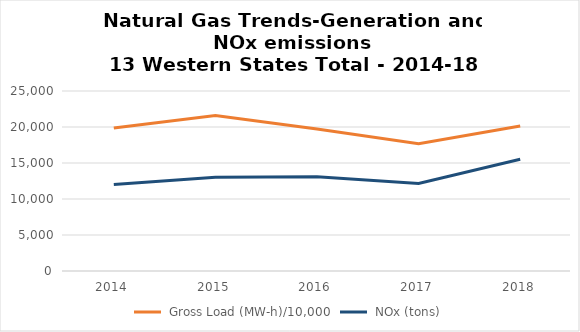
| Category |  Gross Load (MW-h) |  Gross Load (MW-h)/10,000 |  NOx (tons) |
|---|---|---|---|
| 2014.0 |  | 19857.314 | 12017.315 |
| 2015.0 |  | 21587.932 | 13026.052 |
| 2016.0 |  | 19721.31 | 13089.904 |
| 2017.0 |  | 17690.347 | 12168.929 |
| 2018.0 |  | 20125 | 15531.113 |